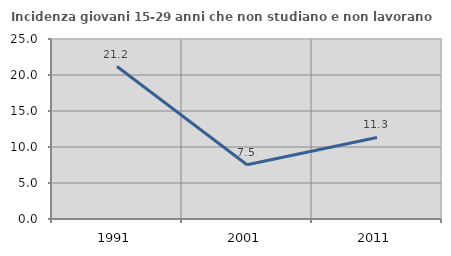
| Category | Incidenza giovani 15-29 anni che non studiano e non lavorano  |
|---|---|
| 1991.0 | 21.171 |
| 2001.0 | 7.539 |
| 2011.0 | 11.325 |